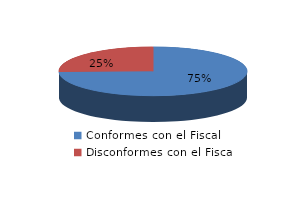
| Category | Series 0 |
|---|---|
| 0 | 50 |
| 1 | 17 |